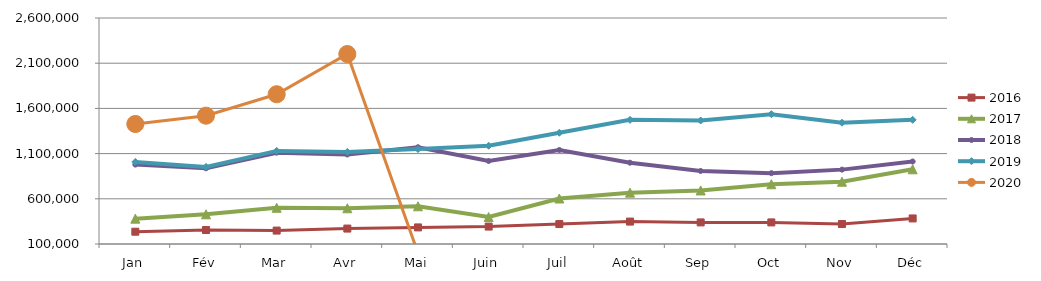
| Category | 2015 | 2016 | 2017 | 2018 | 2019 | 2020 |
|---|---|---|---|---|---|---|
| Jan |  | 235903.093 | 380222.25 | 978468.279 | 1007982.373 | 1427566.131 |
| Fév |  | 254650.591 | 428502.997 | 937137.209 | 952616.766 | 1519499.131 |
| Mar |  | 248425.98 | 500955.694 | 1110199.711 | 1129815.679 | 1756286.369 |
| Avr |  | 270687.752 | 495255.535 | 1090229.308 | 1118398.221 | 2201408.333 |
| Mai |  | 283507.34 | 517298.538 | 1170512.154 | 1150217.455 | 0 |
| Juin |  | 292820.053 | 398427.247 | 1018295.812 | 1186623.687 | 0 |
| Juil |  | 320615.91 | 603419.402 | 1140133.118 | 1330812.699 | 0 |
| Août |  | 348014.816 | 667973.667 | 999343.146 | 1473280.035 | 0 |
| Sep |  | 338807.949 | 692403.495 | 907808.882 | 1466448.158 | 0 |
| Oct |  | 338820.212 | 760969.174 | 883825.979 | 1536100.268 | 0 |
| Nov |  | 320858.147 | 789037.665 | 922678.039 | 1441770.199 | 0 |
| Déc |  | 382727.181 | 926372.399 | 1012620.724 | 1473565.92 | 0 |